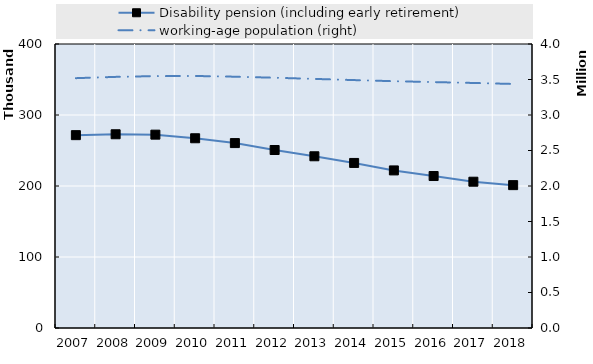
| Category | Disability pension (including early retirement) | 0 | Series 14 | Series 15 | Series 16 | Series 17 | Series 18 | Series 19 |
|---|---|---|---|---|---|---|---|---|
| 2007.0 | 271624 |  |  |  |  |  |  |  |
| 2008.0 | 272878 |  |  |  |  |  |  |  |
| 2009.0 | 272326 |  |  |  |  |  |  |  |
| 2010.0 | 267248 |  |  |  |  |  |  |  |
| 2011.0 | 260453 |  |  |  |  |  |  |  |
| 2012.0 | 250703 |  |  |  |  |  |  |  |
| 2013.0 | 241872 |  |  |  |  |  |  |  |
| 2014.0 | 232475 |  |  |  |  |  |  |  |
| 2015.0 | 221952 |  |  |  |  |  |  |  |
| 2016.0 | 214046 |  |  |  |  |  |  |  |
| 2017.0 | 206048 |  |  |  |  |  |  |  |
| 2018.0 | 201216 |  |  |  |  |  |  |  |